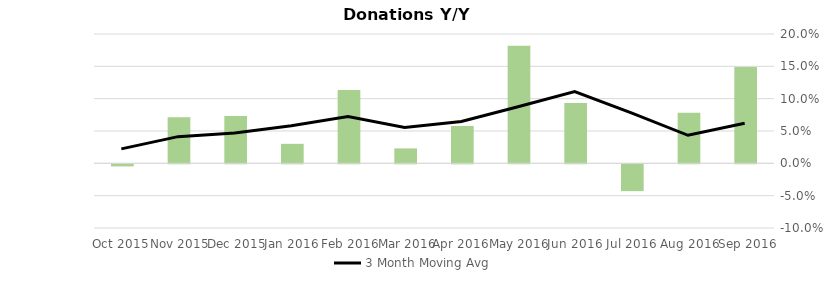
| Category | Donation Index Amount Y/Y Growth |
|---|---|
| Sep 2016 | 0.149 |
| Aug 2016 | 0.078 |
| Jul 2016 | -0.041 |
| Jun 2016 | 0.093 |
| May 2016 | 0.182 |
| Apr 2016 | 0.058 |
| Mar 2016 | 0.023 |
| Feb 2016 | 0.114 |
| Jan 2016 | 0.03 |
| Dec 2015 | 0.073 |
| Nov 2015 | 0.071 |
| Oct 2015 | -0.003 |